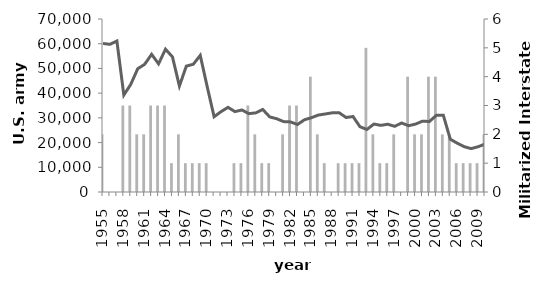
| Category | MIDs |
|---|---|
| 0 | 2 |
| 1 | 0 |
| 2 | 0 |
| 3 | 3 |
| 4 | 3 |
| 5 | 2 |
| 6 | 2 |
| 7 | 3 |
| 8 | 3 |
| 9 | 3 |
| 10 | 1 |
| 11 | 2 |
| 12 | 1 |
| 13 | 1 |
| 14 | 1 |
| 15 | 1 |
| 16 | 0 |
| 17 | 0 |
| 18 | 0 |
| 19 | 1 |
| 20 | 1 |
| 21 | 3 |
| 22 | 2 |
| 23 | 1 |
| 24 | 1 |
| 25 | 0 |
| 26 | 2 |
| 27 | 3 |
| 28 | 3 |
| 29 | 0 |
| 30 | 4 |
| 31 | 2 |
| 32 | 1 |
| 33 | 0 |
| 34 | 1 |
| 35 | 1 |
| 36 | 1 |
| 37 | 1 |
| 38 | 5 |
| 39 | 2 |
| 40 | 1 |
| 41 | 1 |
| 42 | 2 |
| 43 | 0 |
| 44 | 4 |
| 45 | 2 |
| 46 | 2 |
| 47 | 4 |
| 48 | 4 |
| 49 | 2 |
| 50 | 2 |
| 51 | 1 |
| 52 | 1 |
| 53 | 1 |
| 54 | 1 |
| 55 | 2 |